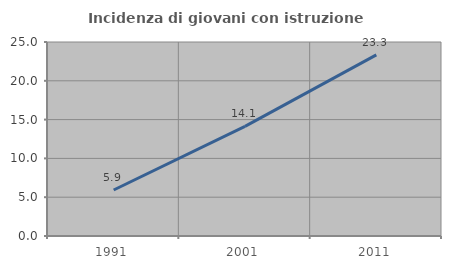
| Category | Incidenza di giovani con istruzione universitaria |
|---|---|
| 1991.0 | 5.926 |
| 2001.0 | 14.13 |
| 2011.0 | 23.348 |